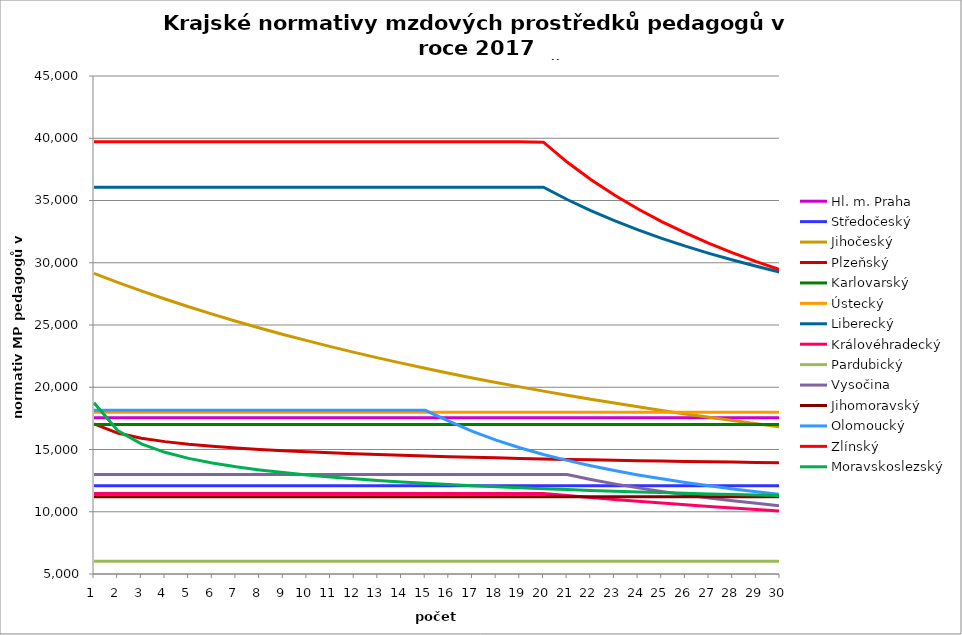
| Category | Hl. m. Praha | Středočeský | Jihočeský | Plzeňský | Karlovarský  | Ústecký   | Liberecký | Královéhradecký | Pardubický | Vysočina | Jihomoravský | Olomoucký | Zlínský | Moravskoslezský |
|---|---|---|---|---|---|---|---|---|---|---|---|---|---|---|
| 0 | 17540.399 | 12085.225 | 29144.953 | 17065.183 | 17000 | 17988.82 | 36063.29 | 11471.338 | 6030.48 | 12987.917 | 11210.627 | 18145.624 | 39713.089 | 18748.669 |
| 1 | 17540.399 | 12085.225 | 28426.203 | 16321.338 | 17000 | 17988.82 | 36063.29 | 11471.338 | 6030.48 | 12987.917 | 11210.627 | 18145.624 | 39713.089 | 16521.105 |
| 2 | 17540.399 | 12085.225 | 27742.05 | 15910.079 | 17000 | 17988.82 | 36063.29 | 11471.338 | 6030.48 | 12987.917 | 11210.627 | 18145.624 | 39713.089 | 15450.292 |
| 3 | 17540.399 | 12085.225 | 27090.055 | 15632.039 | 17000 | 17988.82 | 36063.29 | 11471.338 | 6030.48 | 12987.917 | 11210.627 | 18145.624 | 39713.089 | 14773.532 |
| 4 | 17540.399 | 12085.225 | 26468.003 | 15422.414 | 17000 | 17988.82 | 36063.29 | 11471.338 | 6030.48 | 12987.917 | 11210.627 | 18145.624 | 39713.089 | 14287.517 |
| 5 | 17540.399 | 12085.225 | 25873.877 | 15261.611 | 17000 | 17988.82 | 36063.29 | 11471.338 | 6030.48 | 12987.917 | 11210.627 | 18145.624 | 39713.089 | 13911.365 |
| 6 | 17540.399 | 12085.225 | 25305.838 | 15118.31 | 17000 | 17988.82 | 36063.29 | 11471.338 | 6030.48 | 12987.917 | 11210.627 | 18145.624 | 39713.089 | 13606.867 |
| 7 | 17540.399 | 12085.225 | 24762.205 | 15005.592 | 17000 | 17988.82 | 36063.29 | 11471.338 | 6030.48 | 12987.917 | 11210.627 | 18145.624 | 39713.089 | 13354.676 |
| 8 | 17540.399 | 12085.225 | 24241.438 | 14901.435 | 17000 | 17988.82 | 36063.29 | 11471.338 | 6030.48 | 12987.917 | 11210.627 | 18145.624 | 39713.089 | 13144.279 |
| 9 | 17540.399 | 12085.225 | 23742.124 | 14812.328 | 17000 | 17988.82 | 36063.29 | 11471.338 | 6030.48 | 12987.917 | 11210.627 | 18145.624 | 39713.089 | 12956.273 |
| 10 | 17540.399 | 12085.225 | 23262.964 | 14731.016 | 17000 | 17988.82 | 36063.29 | 11471.338 | 6030.48 | 12987.917 | 11210.627 | 18145.624 | 39713.089 | 12794.189 |
| 11 | 17540.399 | 12085.225 | 22802.763 | 14657.26 | 17000 | 17988.82 | 36063.29 | 11471.338 | 6030.48 | 12987.917 | 11210.627 | 18145.624 | 39713.089 | 12646.191 |
| 12 | 17540.399 | 12085.225 | 22360.416 | 14590.847 | 17000 | 17988.82 | 36063.29 | 11471.338 | 6030.48 | 12987.917 | 11210.627 | 18145.624 | 39713.089 | 12516.384 |
| 13 | 17540.399 | 12085.225 | 21934.904 | 14531.588 | 17000 | 17988.82 | 36063.29 | 11471.338 | 6030.48 | 12987.917 | 11210.627 | 18145.624 | 39713.089 | 12398.905 |
| 14 | 17540.399 | 12085.225 | 21525.285 | 14472.809 | 17000 | 17988.82 | 36063.29 | 11471.338 | 6030.48 | 12987.917 | 11210.627 | 18145.624 | 39713.089 | 12288.372 |
| 15 | 17540.399 | 12085.225 | 21130.684 | 14420.958 | 17000 | 17988.82 | 36063.29 | 11471.338 | 6030.48 | 12987.917 | 11210.627 | 17278.667 | 39713.089 | 12189.158 |
| 16 | 17540.399 | 12085.225 | 20750.29 | 14375.893 | 17000 | 17988.82 | 36063.29 | 11471.338 | 6030.48 | 12987.917 | 11210.627 | 16455.873 | 39713.089 | 12096.147 |
| 17 | 17540.399 | 12085.225 | 20383.35 | 14331.108 | 17000 | 17988.82 | 36063.29 | 11471.338 | 6030.48 | 12987.917 | 11210.627 | 15755.623 | 39713.089 | 12009.091 |
| 18 | 17540.399 | 12085.225 | 20029.161 | 14286.602 | 17000 | 17988.82 | 36063.29 | 11471.338 | 6030.48 | 12987.917 | 11210.627 | 15141.967 | 39713.089 | 11927.765 |
| 19 | 17540.399 | 12085.225 | 19687.072 | 14242.371 | 17000 | 17988.82 | 36063.29 | 11471.338 | 6030.48 | 12987.917 | 11210.627 | 14601.69 | 39681.862 | 11856.395 |
| 20 | 17540.399 | 12085.225 | 19356.472 | 14204.676 | 17000 | 17988.82 | 35079.368 | 11302.828 | 6030.48 | 12987.917 | 11210.627 | 14124.251 | 38087.978 | 11785.874 |
| 21 | 17540.399 | 12085.225 | 19036.792 | 14173.415 | 17000 | 17988.82 | 34189.959 | 11143.23 | 6030.48 | 12594.328 | 11210.627 | 13695.112 | 36683.101 | 11716.186 |
| 22 | 17540.399 | 12085.225 | 18727.499 | 14136.084 | 17000 | 17988.82 | 33381.233 | 10988.076 | 6030.48 | 12240.408 | 11210.627 | 13308.344 | 35434.217 | 11655.882 |
| 23 | 17540.399 | 12085.225 | 18428.096 | 14105.125 | 17000 | 17988.82 | 32641.988 | 10837.183 | 6030.48 | 11919.26 | 11210.627 | 12959 | 34315.662 | 11596.196 |
| 24 | 17540.399 | 12085.225 | 18138.116 | 14074.301 | 17000 | 17988.82 | 31963.05 | 10694.093 | 6030.48 | 11626.884 | 11210.627 | 12642.927 | 33307.178 | 11537.118 |
| 25 | 17540.399 | 12085.225 | 17857.121 | 14043.611 | 17000 | 17988.82 | 31336.825 | 10558.353 | 6030.48 | 11359.077 | 11210.627 | 12351.708 | 32392.554 | 11482.796 |
| 26 | 17540.399 | 12085.225 | 17584.699 | 14013.055 | 17000 | 17988.82 | 30756.975 | 10422.486 | 6030.48 | 11112.669 | 11210.627 | 12082.984 | 31558.654 | 11433.105 |
| 27 | 17540.399 | 12085.225 | 17320.464 | 13988.705 | 17000 | 17988.82 | 30218.162 | 10296.956 | 6030.48 | 10885.311 | 11210.627 | 11834.703 | 30794.723 | 11383.842 |
| 28 | 17540.399 | 12085.225 | 17064.052 | 13958.388 | 17000 | 17988.82 | 29715.857 | 10171.051 | 6030.48 | 10674.252 | 11210.627 | 11605.075 | 30091.862 | 11339.056 |
| 29 | 17540.399 | 12085.225 | 16815.122 | 13934.228 | 17000 | 17988.82 | 29246.191 | 10051.47 | 6030.48 | 10478.142 | 11210.627 | 11392.527 | 29442.645 | 11294.621 |